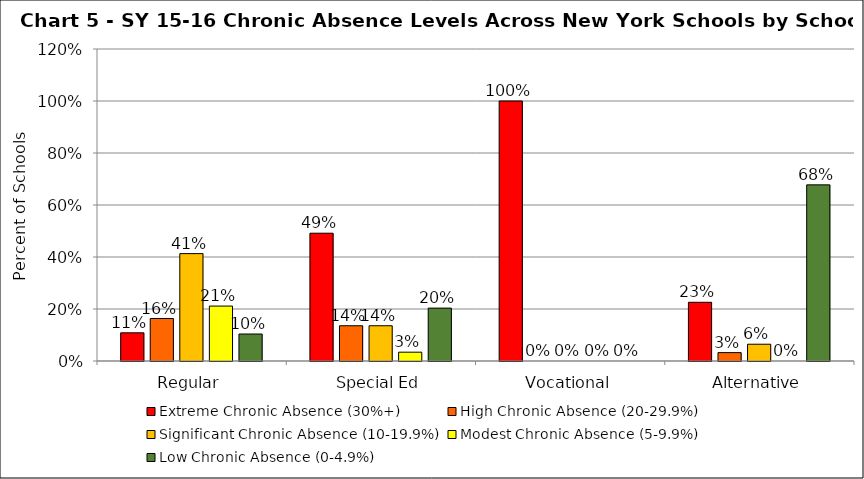
| Category | Extreme Chronic Absence (30%+) | High Chronic Absence (20-29.9%) | Significant Chronic Absence (10-19.9%) | Modest Chronic Absence (5-9.9%) | Low Chronic Absence (0-4.9%) |
|---|---|---|---|---|---|
| 0 | 0.108 | 0.163 | 0.413 | 0.211 | 0.104 |
| 1 | 0.492 | 0.136 | 0.136 | 0.034 | 0.203 |
| 2 | 1 | 0 | 0 | 0 | 0 |
| 3 | 0.226 | 0.032 | 0.065 | 0 | 0.677 |